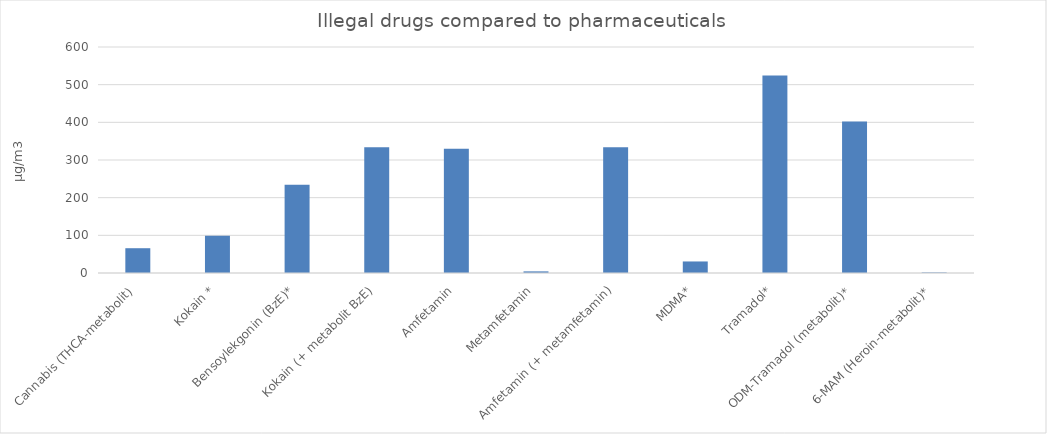
| Category | Series 0 |
|---|---|
| Cannabis (THCA-metabolit) | 65.8 |
| Kokain * | 99.2 |
| Bensoylekgonin (BzE)* | 234.467 |
| Kokain (+ metabolit BzE) | 333.633 |
| Amfetamin | 329.633 |
| Metamfetamin | 4.3 |
| Amfetamin (+ metamfetamin) | 333.933 |
| MDMA* | 30.633 |
| Tramadol* | 524.067 |
| ODM-Tramadol (metabolit)* | 402.533 |
| 6-MAM (Heroin-metabolit)* | 1.4 |